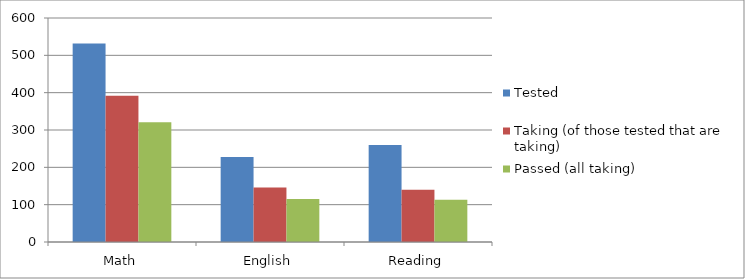
| Category | Tested | Taking (of those tested that are taking) | Passed (all taking) |
|---|---|---|---|
| Math | 532 | 392 | 321 |
| English | 228 | 146 | 115 |
| Reading | 260 | 140 | 113 |